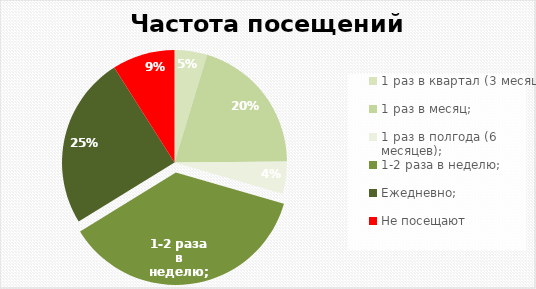
| Category | Итог |
|---|---|
| 1 раз в квартал (3 месяца); | 206 |
| 1 раз в месяц; | 886 |
| 1 раз в полгода (6 месяцев); | 202 |
| 1-2 раза в неделю; | 1613 |
| Ежедневно; | 1088 |
| Не посещают | 395 |